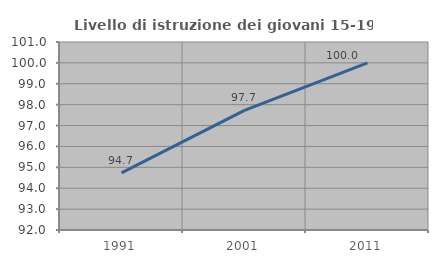
| Category | Livello di istruzione dei giovani 15-19 anni |
|---|---|
| 1991.0 | 94.737 |
| 2001.0 | 97.727 |
| 2011.0 | 100 |